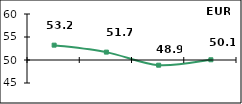
| Category | Диффузионный индекс* |
|---|---|
| 0 | 53.23 |
| 1 | 51.715 |
| 2 | 48.87 |
| 3 | 50.05 |